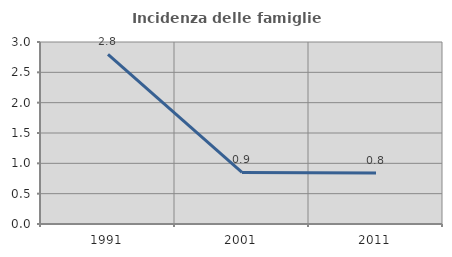
| Category | Incidenza delle famiglie numerose |
|---|---|
| 1991.0 | 2.795 |
| 2001.0 | 0.851 |
| 2011.0 | 0.839 |